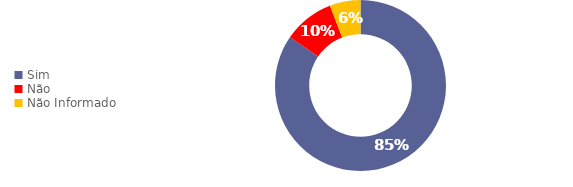
| Category | Total |
|---|---|
| Sim | 552 |
| Não | 63 |
| Não Informado | 38 |